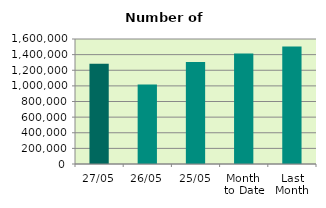
| Category | Series 0 |
|---|---|
| 27/05 | 1284588 |
| 26/05 | 1017656 |
| 25/05 | 1304424 |
| Month 
to Date | 1413827.9 |
| Last
Month | 1505043.474 |